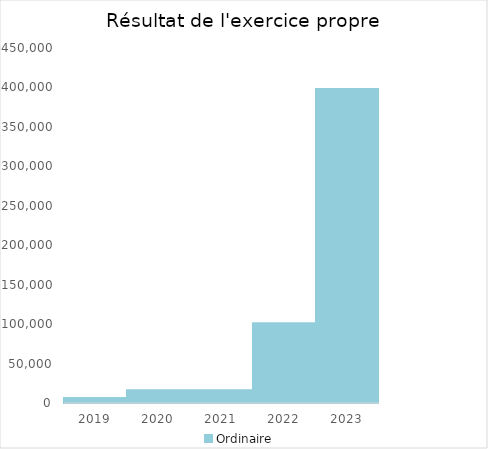
| Category |   | Ordinaire |    |
|---|---|---|---|
| 2019.0 |  | 6351.38 |  |
| 2020.0 |  | 16090.44 |  |
| 2021.0 |  | 16115.65 |  |
| 2022.0 |  | 101112.47 |  |
| 2023.0 |  | 398007.78 |  |